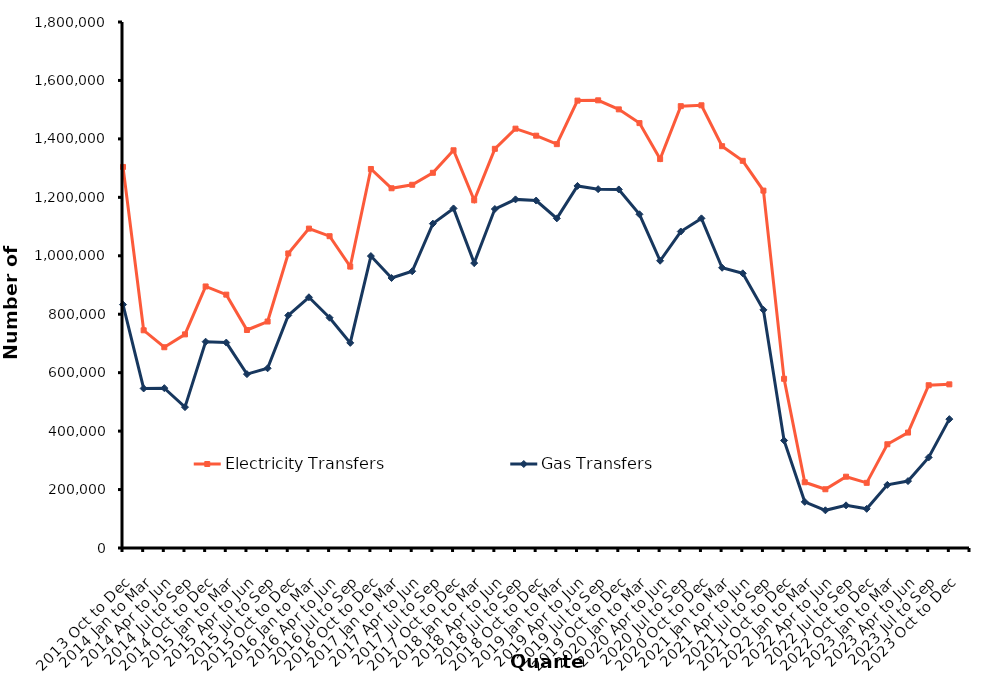
| Category | Electricity Transfers | Gas Transfers |
|---|---|---|
| 2013 Oct to Dec | 1304000 | 833000 |
| 2014 Jan to Mar | 745000 | 546000 |
| 2014 Apr to Jun | 687000 | 547000 |
| 2014 Jul to Sep | 731000 | 482000 |
| 2014 Oct to Dec | 895000 | 706000 |
| 2015 Jan to Mar | 867000 | 703000 |
| 2015 Apr to Jun | 746000 | 595000 |
| 2015 Jul to Sep | 775000 | 615000 |
| 2015 Oct to Dec | 1008000 | 796000 |
| 2016 Jan to Mar | 1093000 | 858000 |
| 2016 Apr to Jun | 1067000 | 788000 |
| 2016 Jul to Sep | 963000 | 702000 |
| 2016 Oct to Dec | 1297000 | 999000 |
| 2017 Jan to Mar | 1231000 | 924000 |
| 2017 Apr to Jun | 1243000 | 947000 |
| 2017 Jul to Sep | 1284000 | 1110000 |
| 2017 Oct to Dec | 1361000 | 1162000 |
| 2018 Jan to Mar | 1190000 | 975000 |
| 2018 Apr to Jun | 1366000 | 1160000 |
| 2018 Jul to Sep | 1435000 | 1193000 |
| 2018 Oct to Dec | 1411000 | 1189000 |
| 2019 Jan to Mar | 1382000 | 1128000 |
| 2019 Apr to Jun | 1531000 | 1239000 |
| 2019 Jul to Sep | 1532000 | 1228000 |
| 2019 Oct to Dec | 1501000 | 1227000 |
| 2020 Jan to Mar | 1454000 | 1142000 |
| 2020 Apr to Jun | 1331000 | 983000 |
| 2020 Jul to Sep | 1512000 | 1083000 |
| 2020 Oct to Dec | 1515000 | 1128000 |
| 2021 Jan to Mar | 1375000 | 959000 |
| 2021 Apr to Jun | 1325000 | 940000 |
| 2021 Jul to Sep | 1223000 | 815000 |
| 2021 Oct to Dec | 579000 | 368000 |
| 2022 Jan to Mar | 225000 | 158000 |
| 2022 Apr to Jun | 201000 | 129000 |
| 2022 Jul to Sep | 244000 | 146000 |
| 2022 Oct to Dec | 223000 | 134000 |
| 2023 Jan to Mar | 355000 | 216000 |
| 2023 Apr to Jun | 395000 | 229000 |
| 2023 Jul to Sep | 557000 | 310000 |
| 2023 Oct to Dec | 560000 | 441000 |